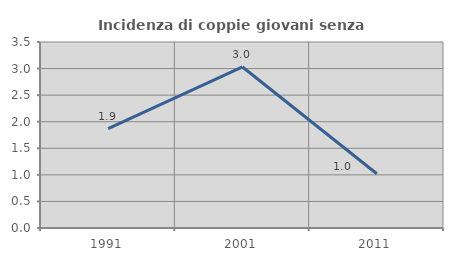
| Category | Incidenza di coppie giovani senza figli |
|---|---|
| 1991.0 | 1.869 |
| 2001.0 | 3.03 |
| 2011.0 | 1.02 |